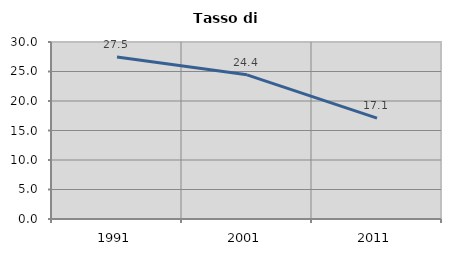
| Category | Tasso di disoccupazione   |
|---|---|
| 1991.0 | 27.471 |
| 2001.0 | 24.436 |
| 2011.0 | 17.095 |